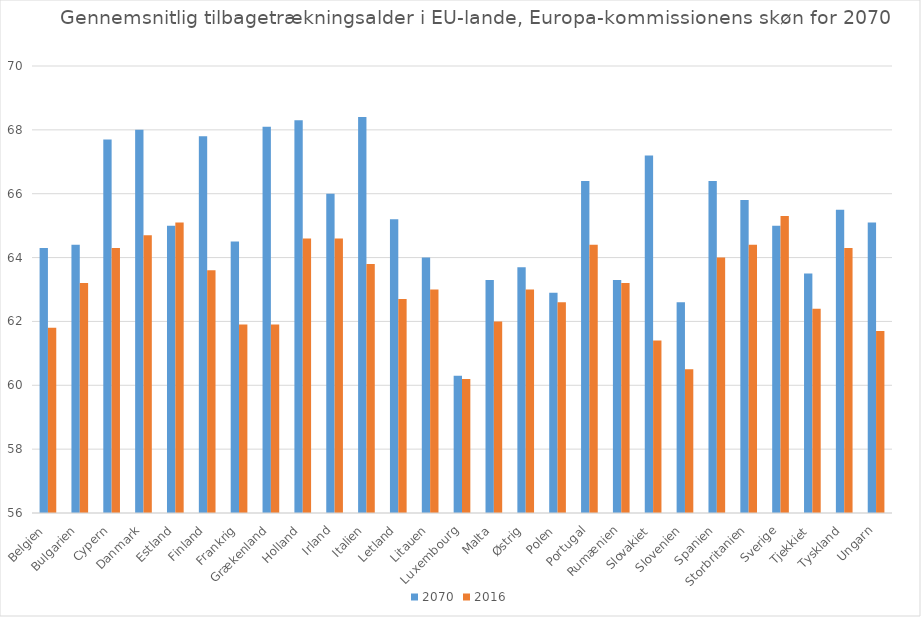
| Category | 2070 | 2016 |
|---|---|---|
| Belgien | 64.3 | 61.8 |
| Bulgarien | 64.4 | 63.2 |
| Cypern | 67.7 | 64.3 |
| Danmark | 68 | 64.7 |
| Estland | 65 | 65.1 |
| Finland | 67.8 | 63.6 |
| Frankrig | 64.5 | 61.9 |
| Grækenland | 68.1 | 61.9 |
| Holland | 68.3 | 64.6 |
| Irland | 66 | 64.6 |
| Italien | 68.4 | 63.8 |
| Letland | 65.2 | 62.7 |
| Litauen | 64 | 63 |
| Luxembourg | 60.3 | 60.2 |
| Malta | 63.3 | 62 |
| Østrig | 63.7 | 63 |
| Polen | 62.9 | 62.6 |
| Portugal | 66.4 | 64.4 |
| Rumænien | 63.3 | 63.2 |
| Slovakiet | 67.2 | 61.4 |
| Slovenien | 62.6 | 60.5 |
| Spanien | 66.4 | 64 |
| Storbritanien | 65.8 | 64.4 |
| Sverige | 65 | 65.3 |
| Tjekkiet | 63.5 | 62.4 |
| Tyskland | 65.5 | 64.3 |
| Ungarn | 65.1 | 61.7 |